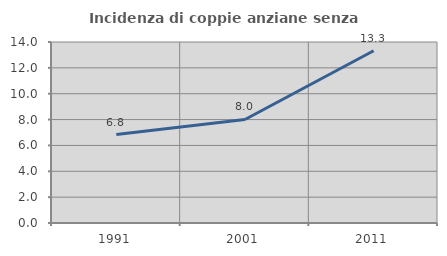
| Category | Incidenza di coppie anziane senza figli  |
|---|---|
| 1991.0 | 6.842 |
| 2001.0 | 8.007 |
| 2011.0 | 13.321 |